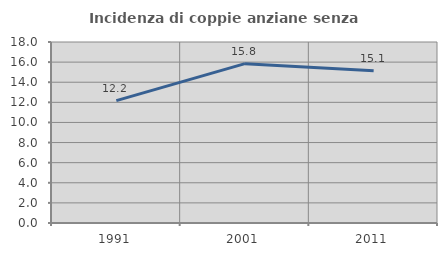
| Category | Incidenza di coppie anziane senza figli  |
|---|---|
| 1991.0 | 12.165 |
| 2001.0 | 15.847 |
| 2011.0 | 15.145 |